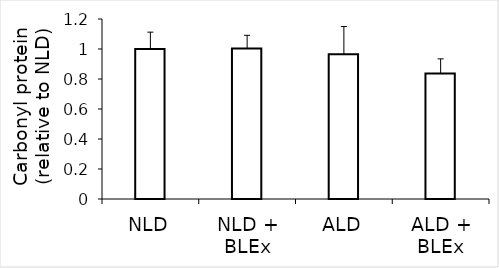
| Category | Series 0 |
|---|---|
| NLD | 1 |
| NLD + BLEx | 1.003 |
| ALD | 0.964 |
| ALD + BLEx | 0.837 |